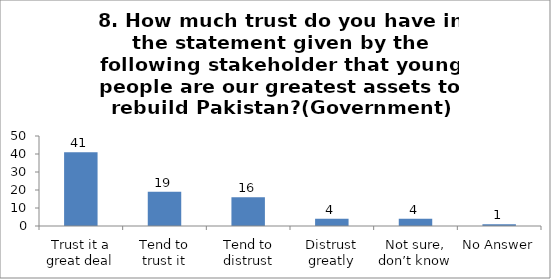
| Category | 8. How much trust do you have in the statement given by the following stakeholder that young people are our greatest assets to rebuild Pakistan?(Government) |
|---|---|
| Trust it a great deal | 41 |
| Tend to trust it | 19 |
| Tend to distrust | 16 |
| Distrust greatly | 4 |
| Not sure, don’t know | 4 |
| No Answer | 1 |